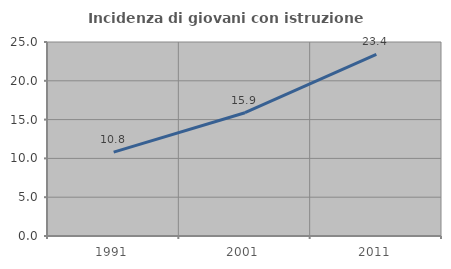
| Category | Incidenza di giovani con istruzione universitaria |
|---|---|
| 1991.0 | 10.801 |
| 2001.0 | 15.889 |
| 2011.0 | 23.4 |